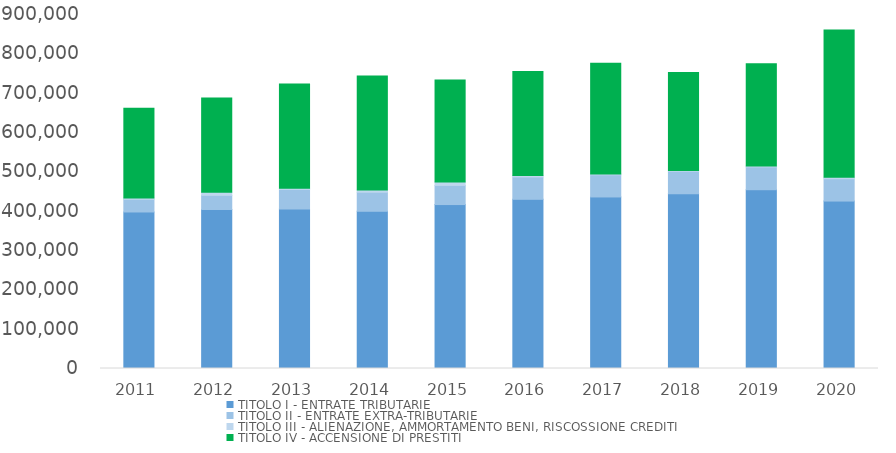
| Category | TITOLO I - ENTRATE TRIBUTARIE | TITOLO II - ENTRATE EXTRA-TRIBUTARIE | TITOLO III - ALIENAZIONE, AMMORTAMENTO BENI, RISCOSSIONE CREDITI | TITOLO IV - ACCENSIONE DI PRESTITI |
|---|---|---|---|---|
| 2011.0 | 397920.866 | 32084.896 | 3235.46 | 228422.129 |
| 2012.0 | 404223.451 | 35956.159 | 7888.953 | 239783.649 |
| 2013.0 | 405343.119 | 49819.799 | 3353.962 | 264846.999 |
| 2014.0 | 399719.603 | 48477.677 | 5424.732 | 289972.991 |
| 2015.0 | 416797.058 | 48665.553 | 8750.796 | 259542.417 |
| 2016.0 | 430133.794 | 56790.651 | 3756.401 | 264618.209 |
| 2017.0 | 436128.673 | 56159.986 | 2422.837 | 281609.658 |
| 2018.0 | 444572.682 | 56824.006 | 2115.122 | 249065.559 |
| 2019.0 | 454539.451 | 57878.49 | 2100.437 | 260408.77 |
| 2020.0 | 425712.853 | 56663.278 | 3741.676 | 374284.433 |